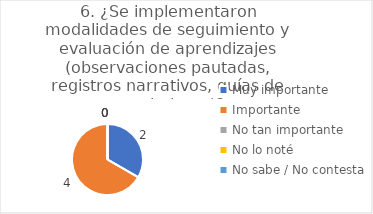
| Category | 6. ¿Se implementaron modalidades de seguimiento y evaluación de aprendizajes (observaciones pautadas, registros narrativos, guías de seguimiento)? |
|---|---|
| Muy importante  | 0.333 |
| Importante  | 0.667 |
| No tan importante  | 0 |
| No lo noté  | 0 |
| No sabe / No contesta | 0 |